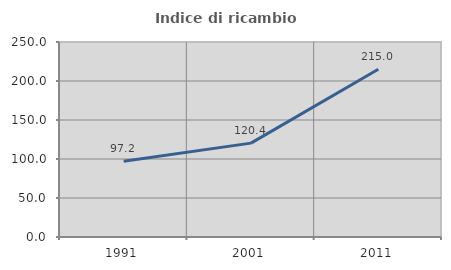
| Category | Indice di ricambio occupazionale  |
|---|---|
| 1991.0 | 97.245 |
| 2001.0 | 120.364 |
| 2011.0 | 215 |